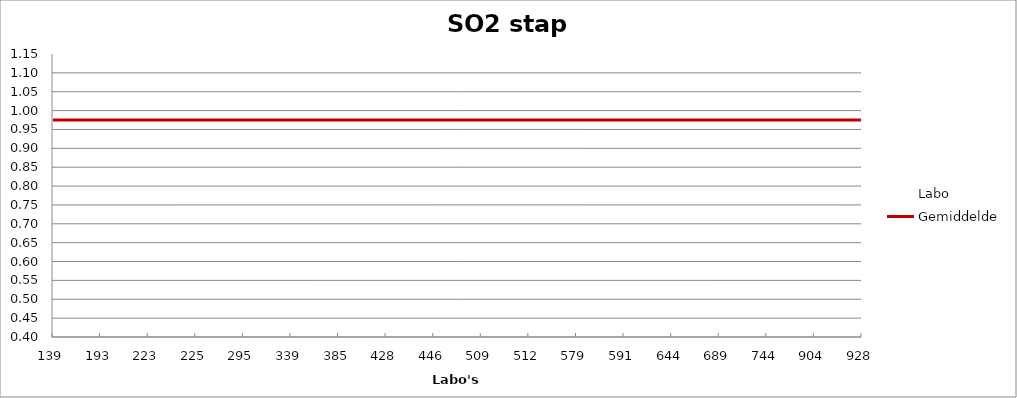
| Category | Labo | Gemiddelde |
|---|---|---|
| 139.0 | 1.132 | 0.975 |
| 193.0 | 0.902 | 0.975 |
| 223.0 | 1.072 | 0.975 |
| 225.0 | 0.885 | 0.975 |
| 295.0 | 0.97 | 0.975 |
| 339.0 | 0.851 | 0.975 |
| 385.0 | 1.057 | 0.975 |
| 428.0 | 0.848 | 0.975 |
| 446.0 | 1.042 | 0.975 |
| 509.0 | 0.969 | 0.975 |
| 512.0 | 0.4 | 0.975 |
| 579.0 | 1.044 | 0.975 |
| 591.0 | 1.098 | 0.975 |
| 644.0 | 1.004 | 0.975 |
| 689.0 | 1.086 | 0.975 |
| 744.0 | 0.865 | 0.975 |
| 904.0 | 1.001 | 0.975 |
| 928.0 | 0.916 | 0.975 |